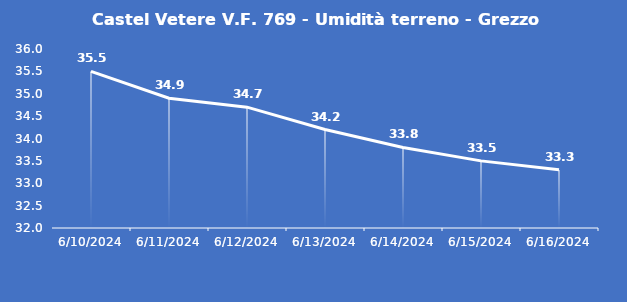
| Category | Castel Vetere V.F. 769 - Umidità terreno - Grezzo (%VWC) |
|---|---|
| 6/10/24 | 35.5 |
| 6/11/24 | 34.9 |
| 6/12/24 | 34.7 |
| 6/13/24 | 34.2 |
| 6/14/24 | 33.8 |
| 6/15/24 | 33.5 |
| 6/16/24 | 33.3 |